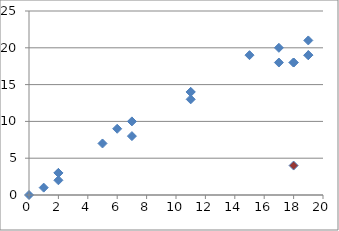
| Category | X2 |
|---|---|
| 18.0 | 18 |
| 2.0 | 2 |
| 11.0 | 13 |
| 7.0 | 10 |
| 18.0 | 18 |
| 19.0 | 21 |
| 6.0 | 9 |
| 0.0 | 0 |
| 17.0 | 20 |
| 19.0 | 19 |
| 5.0 | 7 |
| 11.0 | 14 |
| 2.0 | 3 |
| 7.0 | 8 |
| 15.0 | 19 |
| 17.0 | 18 |
| 2.0 | 3 |
| 1.0 | 1 |
| 11.0 | 14 |
| 19.0 | 19 |
| 18.0 | 4 |